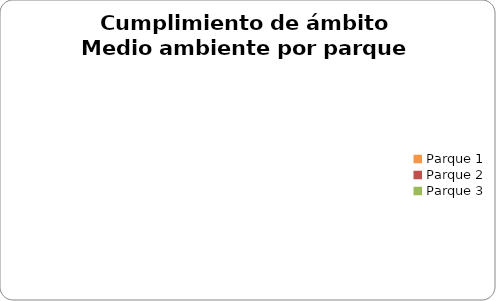
| Category | Medio ambiente |
|---|---|
| Parque 1 | 0 |
| Parque 2 | 0 |
| Parque 3 | 0 |